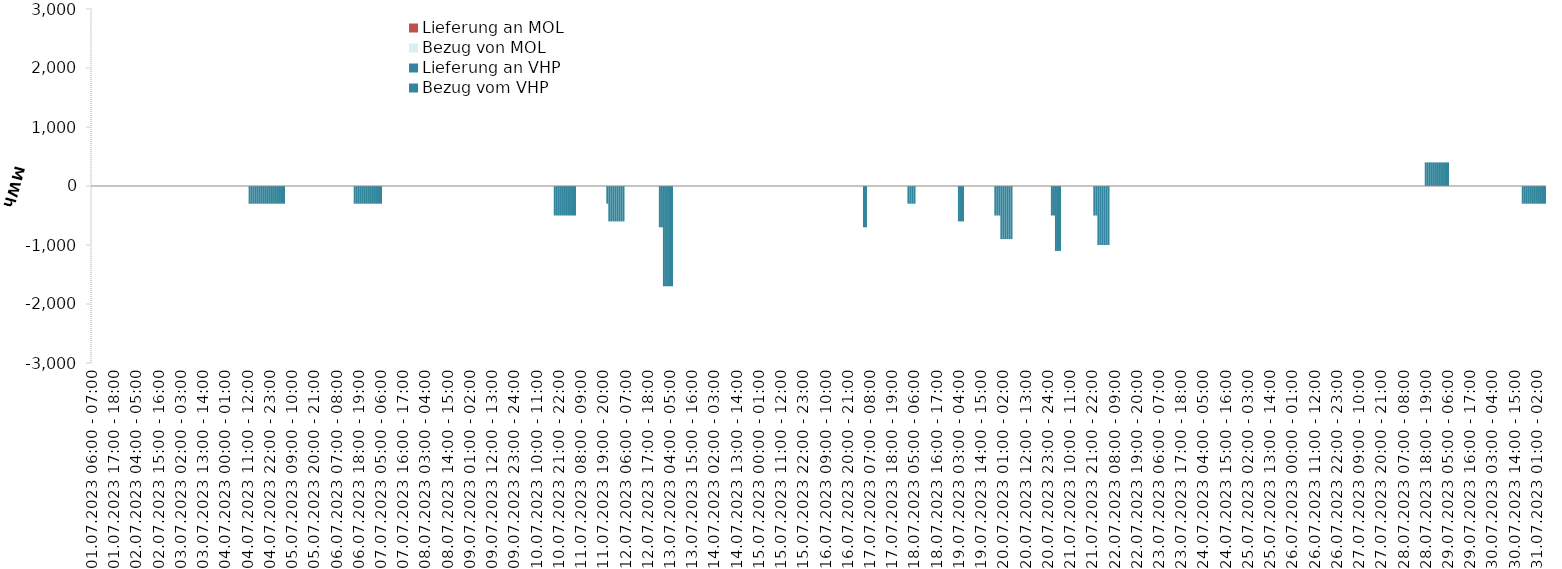
| Category | Bezug vom VHP | Lieferung an VHP | Bezug von MOL | Lieferung an MOL |
|---|---|---|---|---|
| 01.07.2023 06:00 - 07:00 | 0 | 0 | 0 | 0 |
| 01.07.2023 07:00 - 08:00 | 0 | 0 | 0 | 0 |
| 01.07.2023 08:00 - 09:00 | 0 | 0 | 0 | 0 |
| 01.07.2023 09:00 - 10:00 | 0 | 0 | 0 | 0 |
| 01.07.2023 10:00 - 11:00 | 0 | 0 | 0 | 0 |
| 01.07.2023 11:00 - 12:00 | 0 | 0 | 0 | 0 |
| 01.07.2023 12:00 - 13:00 | 0 | 0 | 0 | 0 |
| 01.07.2023 13:00 - 14:00 | 0 | 0 | 0 | 0 |
| 01.07.2023 14:00 - 15:00 | 0 | 0 | 0 | 0 |
| 01.07.2023 15:00 - 16:00 | 0 | 0 | 0 | 0 |
| 01.07.2023 16:00 - 17:00 | 0 | 0 | 0 | 0 |
| 01.07.2023 17:00 - 18:00 | 0 | 0 | 0 | 0 |
| 01.07.2023 18:00 - 19:00 | 0 | 0 | 0 | 0 |
| 01.07.2023 19:00 - 20:00 | 0 | 0 | 0 | 0 |
| 01.07.2023 20:00 - 21:00 | 0 | 0 | 0 | 0 |
| 01.07.2023 21:00 - 22:00 | 0 | 0 | 0 | 0 |
| 01.07.2023 22:00 - 23:00 | 0 | 0 | 0 | 0 |
| 01.07.2023 23:00 - 24:00 | 0 | 0 | 0 | 0 |
| 02.07.2023 00:00 - 01:00 | 0 | 0 | 0 | 0 |
| 02.07.2023 01:00 - 02:00 | 0 | 0 | 0 | 0 |
| 02.07.2023 02:00 - 03:00 | 0 | 0 | 0 | 0 |
| 02.07.2023 03:00 - 04:00 | 0 | 0 | 0 | 0 |
| 02.07.2023 04:00 - 05:00 | 0 | 0 | 0 | 0 |
| 02.07.2023 05:00 - 06:00 | 0 | 0 | 0 | 0 |
| 02.07.2023 06:00 - 07:00 | 0 | 0 | 0 | 0 |
| 02.07.2023 07:00 - 08:00 | 0 | 0 | 0 | 0 |
| 02.07.2023 08:00 - 09:00 | 0 | 0 | 0 | 0 |
| 02.07.2023 09:00 - 10:00 | 0 | 0 | 0 | 0 |
| 02.07.2023 10:00 - 11:00 | 0 | 0 | 0 | 0 |
| 02.07.2023 11:00 - 12:00 | 0 | 0 | 0 | 0 |
| 02.07.2023 12:00 - 13:00 | 0 | 0 | 0 | 0 |
| 02.07.2023 13:00 - 14:00 | 0 | 0 | 0 | 0 |
| 02.07.2023 14:00 - 15:00 | 0 | 0 | 0 | 0 |
| 02.07.2023 15:00 - 16:00 | 0 | 0 | 0 | 0 |
| 02.07.2023 16:00 - 17:00 | 0 | 0 | 0 | 0 |
| 02.07.2023 17:00 - 18:00 | 0 | 0 | 0 | 0 |
| 02.07.2023 18:00 - 19:00 | 0 | 0 | 0 | 0 |
| 02.07.2023 19:00 - 20:00 | 0 | 0 | 0 | 0 |
| 02.07.2023 20:00 - 21:00 | 0 | 0 | 0 | 0 |
| 02.07.2023 21:00 - 22:00 | 0 | 0 | 0 | 0 |
| 02.07.2023 22:00 - 23:00 | 0 | 0 | 0 | 0 |
| 02.07.2023 23:00 - 24:00 | 0 | 0 | 0 | 0 |
| 03.07.2023 00:00 - 01:00 | 0 | 0 | 0 | 0 |
| 03.07.2023 01:00 - 02:00 | 0 | 0 | 0 | 0 |
| 03.07.2023 02:00 - 03:00 | 0 | 0 | 0 | 0 |
| 03.07.2023 03:00 - 04:00 | 0 | 0 | 0 | 0 |
| 03.07.2023 04:00 - 05:00 | 0 | 0 | 0 | 0 |
| 03.07.2023 05:00 - 06:00 | 0 | 0 | 0 | 0 |
| 03.07.2023 06:00 - 07:00 | 0 | 0 | 0 | 0 |
| 03.07.2023 07:00 - 08:00 | 0 | 0 | 0 | 0 |
| 03.07.2023 08:00 - 09:00 | 0 | 0 | 0 | 0 |
| 03.07.2023 09:00 - 10:00 | 0 | 0 | 0 | 0 |
| 03.07.2023 10:00 - 11:00 | 0 | 0 | 0 | 0 |
| 03.07.2023 11:00 - 12:00 | 0 | 0 | 0 | 0 |
| 03.07.2023 12:00 - 13:00 | 0 | 0 | 0 | 0 |
| 03.07.2023 13:00 - 14:00 | 0 | 0 | 0 | 0 |
| 03.07.2023 14:00 - 15:00 | 0 | 0 | 0 | 0 |
| 03.07.2023 15:00 - 16:00 | 0 | 0 | 0 | 0 |
| 03.07.2023 16:00 - 17:00 | 0 | 0 | 0 | 0 |
| 03.07.2023 17:00 - 18:00 | 0 | 0 | 0 | 0 |
| 03.07.2023 18:00 - 19:00 | 0 | 0 | 0 | 0 |
| 03.07.2023 19:00 - 20:00 | 0 | 0 | 0 | 0 |
| 03.07.2023 20:00 - 21:00 | 0 | 0 | 0 | 0 |
| 03.07.2023 21:00 - 22:00 | 0 | 0 | 0 | 0 |
| 03.07.2023 22:00 - 23:00 | 0 | 0 | 0 | 0 |
| 03.07.2023 23:00 - 24:00 | 0 | 0 | 0 | 0 |
| 04.07.2023 00:00 - 01:00 | 0 | 0 | 0 | 0 |
| 04.07.2023 01:00 - 02:00 | 0 | 0 | 0 | 0 |
| 04.07.2023 02:00 - 03:00 | 0 | 0 | 0 | 0 |
| 04.07.2023 03:00 - 04:00 | 0 | 0 | 0 | 0 |
| 04.07.2023 04:00 - 05:00 | 0 | 0 | 0 | 0 |
| 04.07.2023 05:00 - 06:00 | 0 | 0 | 0 | 0 |
| 04.07.2023 06:00 - 07:00 | 0 | 0 | 0 | 0 |
| 04.07.2023 07:00 - 08:00 | 0 | 0 | 0 | 0 |
| 04.07.2023 08:00 - 09:00 | 0 | 0 | 0 | 0 |
| 04.07.2023 09:00 - 10:00 | 0 | 0 | 0 | 0 |
| 04.07.2023 10:00 - 11:00 | 0 | 0 | 0 | 0 |
| 04.07.2023 11:00 - 12:00 | 0 | 0 | 0 | 0 |
| 04.07.2023 12:00 - 13:00 | 0 | -300 | 0 | 0 |
| 04.07.2023 13:00 - 14:00 | 0 | -300 | 0 | 0 |
| 04.07.2023 14:00 - 15:00 | 0 | -300 | 0 | 0 |
| 04.07.2023 15:00 - 16:00 | 0 | -300 | 0 | 0 |
| 04.07.2023 16:00 - 17:00 | 0 | -300 | 0 | 0 |
| 04.07.2023 17:00 - 18:00 | 0 | -300 | 0 | 0 |
| 04.07.2023 18:00 - 19:00 | 0 | -300 | 0 | 0 |
| 04.07.2023 19:00 - 20:00 | 0 | -300 | 0 | 0 |
| 04.07.2023 20:00 - 21:00 | 0 | -300 | 0 | 0 |
| 04.07.2023 21:00 - 22:00 | 0 | -300 | 0 | 0 |
| 04.07.2023 22:00 - 23:00 | 0 | -300 | 0 | 0 |
| 04.07.2023 23:00 - 24:00 | 0 | -300 | 0 | 0 |
| 05.07.2023 00:00 - 01:00 | 0 | -300 | 0 | 0 |
| 05.07.2023 01:00 - 02:00 | 0 | -300 | 0 | 0 |
| 05.07.2023 02:00 - 03:00 | 0 | -300 | 0 | 0 |
| 05.07.2023 03:00 - 04:00 | 0 | -300 | 0 | 0 |
| 05.07.2023 04:00 - 05:00 | 0 | -300 | 0 | 0 |
| 05.07.2023 05:00 - 06:00 | 0 | -300 | 0 | 0 |
| 05.07.2023 06:00 - 07:00 | 0 | 0 | 0 | 0 |
| 05.07.2023 07:00 - 08:00 | 0 | 0 | 0 | 0 |
| 05.07.2023 08:00 - 09:00 | 0 | 0 | 0 | 0 |
| 05.07.2023 09:00 - 10:00 | 0 | 0 | 0 | 0 |
| 05.07.2023 10:00 - 11:00 | 0 | 0 | 0 | 0 |
| 05.07.2023 11:00 - 12:00 | 0 | 0 | 0 | 0 |
| 05.07.2023 12:00 - 13:00 | 0 | 0 | 0 | 0 |
| 05.07.2023 13:00 - 14:00 | 0 | 0 | 0 | 0 |
| 05.07.2023 14:00 - 15:00 | 0 | 0 | 0 | 0 |
| 05.07.2023 15:00 - 16:00 | 0 | 0 | 0 | 0 |
| 05.07.2023 16:00 - 17:00 | 0 | 0 | 0 | 0 |
| 05.07.2023 17:00 - 18:00 | 0 | 0 | 0 | 0 |
| 05.07.2023 18:00 - 19:00 | 0 | 0 | 0 | 0 |
| 05.07.2023 19:00 - 20:00 | 0 | 0 | 0 | 0 |
| 05.07.2023 20:00 - 21:00 | 0 | 0 | 0 | 0 |
| 05.07.2023 21:00 - 22:00 | 0 | 0 | 0 | 0 |
| 05.07.2023 22:00 - 23:00 | 0 | 0 | 0 | 0 |
| 05.07.2023 23:00 - 24:00 | 0 | 0 | 0 | 0 |
| 06.07.2023 00:00 - 01:00 | 0 | 0 | 0 | 0 |
| 06.07.2023 01:00 - 02:00 | 0 | 0 | 0 | 0 |
| 06.07.2023 02:00 - 03:00 | 0 | 0 | 0 | 0 |
| 06.07.2023 03:00 - 04:00 | 0 | 0 | 0 | 0 |
| 06.07.2023 04:00 - 05:00 | 0 | 0 | 0 | 0 |
| 06.07.2023 05:00 - 06:00 | 0 | 0 | 0 | 0 |
| 06.07.2023 06:00 - 07:00 | 0 | 0 | 0 | 0 |
| 06.07.2023 07:00 - 08:00 | 0 | 0 | 0 | 0 |
| 06.07.2023 08:00 - 09:00 | 0 | 0 | 0 | 0 |
| 06.07.2023 09:00 - 10:00 | 0 | 0 | 0 | 0 |
| 06.07.2023 10:00 - 11:00 | 0 | 0 | 0 | 0 |
| 06.07.2023 11:00 - 12:00 | 0 | 0 | 0 | 0 |
| 06.07.2023 12:00 - 13:00 | 0 | 0 | 0 | 0 |
| 06.07.2023 13:00 - 14:00 | 0 | 0 | 0 | 0 |
| 06.07.2023 14:00 - 15:00 | 0 | 0 | 0 | 0 |
| 06.07.2023 15:00 - 16:00 | 0 | 0 | 0 | 0 |
| 06.07.2023 16:00 - 17:00 | 0 | -300 | 0 | 0 |
| 06.07.2023 17:00 - 18:00 | 0 | -300 | 0 | 0 |
| 06.07.2023 18:00 - 19:00 | 0 | -300 | 0 | 0 |
| 06.07.2023 19:00 - 20:00 | 0 | -300 | 0 | 0 |
| 06.07.2023 20:00 - 21:00 | 0 | -300 | 0 | 0 |
| 06.07.2023 21:00 - 22:00 | 0 | -300 | 0 | 0 |
| 06.07.2023 22:00 - 23:00 | 0 | -300 | 0 | 0 |
| 06.07.2023 23:00 - 24:00 | 0 | -300 | 0 | 0 |
| 07.07.2023 00:00 - 01:00 | 0 | -300 | 0 | 0 |
| 07.07.2023 01:00 - 02:00 | 0 | -300 | 0 | 0 |
| 07.07.2023 02:00 - 03:00 | 0 | -300 | 0 | 0 |
| 07.07.2023 03:00 - 04:00 | 0 | -300 | 0 | 0 |
| 07.07.2023 04:00 - 05:00 | 0 | -300 | 0 | 0 |
| 07.07.2023 05:00 - 06:00 | 0 | -300 | 0 | 0 |
| 07.07.2023 06:00 - 07:00 | 0 | 0 | 0 | 0 |
| 07.07.2023 07:00 - 08:00 | 0 | 0 | 0 | 0 |
| 07.07.2023 08:00 - 09:00 | 0 | 0 | 0 | 0 |
| 07.07.2023 09:00 - 10:00 | 0 | 0 | 0 | 0 |
| 07.07.2023 10:00 - 11:00 | 0 | 0 | 0 | 0 |
| 07.07.2023 11:00 - 12:00 | 0 | 0 | 0 | 0 |
| 07.07.2023 12:00 - 13:00 | 0 | 0 | 0 | 0 |
| 07.07.2023 13:00 - 14:00 | 0 | 0 | 0 | 0 |
| 07.07.2023 14:00 - 15:00 | 0 | 0 | 0 | 0 |
| 07.07.2023 15:00 - 16:00 | 0 | 0 | 0 | 0 |
| 07.07.2023 16:00 - 17:00 | 0 | 0 | 0 | 0 |
| 07.07.2023 17:00 - 18:00 | 0 | 0 | 0 | 0 |
| 07.07.2023 18:00 - 19:00 | 0 | 0 | 0 | 0 |
| 07.07.2023 19:00 - 20:00 | 0 | 0 | 0 | 0 |
| 07.07.2023 20:00 - 21:00 | 0 | 0 | 0 | 0 |
| 07.07.2023 21:00 - 22:00 | 0 | 0 | 0 | 0 |
| 07.07.2023 22:00 - 23:00 | 0 | 0 | 0 | 0 |
| 07.07.2023 23:00 - 24:00 | 0 | 0 | 0 | 0 |
| 08.07.2023 00:00 - 01:00 | 0 | 0 | 0 | 0 |
| 08.07.2023 01:00 - 02:00 | 0 | 0 | 0 | 0 |
| 08.07.2023 02:00 - 03:00 | 0 | 0 | 0 | 0 |
| 08.07.2023 03:00 - 04:00 | 0 | 0 | 0 | 0 |
| 08.07.2023 04:00 - 05:00 | 0 | 0 | 0 | 0 |
| 08.07.2023 05:00 - 06:00 | 0 | 0 | 0 | 0 |
| 08.07.2023 06:00 - 07:00 | 0 | 0 | 0 | 0 |
| 08.07.2023 07:00 - 08:00 | 0 | 0 | 0 | 0 |
| 08.07.2023 08:00 - 09:00 | 0 | 0 | 0 | 0 |
| 08.07.2023 09:00 - 10:00 | 0 | 0 | 0 | 0 |
| 08.07.2023 10:00 - 11:00 | 0 | 0 | 0 | 0 |
| 08.07.2023 11:00 - 12:00 | 0 | 0 | 0 | 0 |
| 08.07.2023 12:00 - 13:00 | 0 | 0 | 0 | 0 |
| 08.07.2023 13:00 - 14:00 | 0 | 0 | 0 | 0 |
| 08.07.2023 14:00 - 15:00 | 0 | 0 | 0 | 0 |
| 08.07.2023 15:00 - 16:00 | 0 | 0 | 0 | 0 |
| 08.07.2023 16:00 - 17:00 | 0 | 0 | 0 | 0 |
| 08.07.2023 17:00 - 18:00 | 0 | 0 | 0 | 0 |
| 08.07.2023 18:00 - 19:00 | 0 | 0 | 0 | 0 |
| 08.07.2023 19:00 - 20:00 | 0 | 0 | 0 | 0 |
| 08.07.2023 20:00 - 21:00 | 0 | 0 | 0 | 0 |
| 08.07.2023 21:00 - 22:00 | 0 | 0 | 0 | 0 |
| 08.07.2023 22:00 - 23:00 | 0 | 0 | 0 | 0 |
| 08.07.2023 23:00 - 24:00 | 0 | 0 | 0 | 0 |
| 09.07.2023 00:00 - 01:00 | 0 | 0 | 0 | 0 |
| 09.07.2023 01:00 - 02:00 | 0 | 0 | 0 | 0 |
| 09.07.2023 02:00 - 03:00 | 0 | 0 | 0 | 0 |
| 09.07.2023 03:00 - 04:00 | 0 | 0 | 0 | 0 |
| 09.07.2023 04:00 - 05:00 | 0 | 0 | 0 | 0 |
| 09.07.2023 05:00 - 06:00 | 0 | 0 | 0 | 0 |
| 09.07.2023 06:00 - 07:00 | 0 | 0 | 0 | 0 |
| 09.07.2023 07:00 - 08:00 | 0 | 0 | 0 | 0 |
| 09.07.2023 08:00 - 09:00 | 0 | 0 | 0 | 0 |
| 09.07.2023 09:00 - 10:00 | 0 | 0 | 0 | 0 |
| 09.07.2023 10:00 - 11:00 | 0 | 0 | 0 | 0 |
| 09.07.2023 11:00 - 12:00 | 0 | 0 | 0 | 0 |
| 09.07.2023 12:00 - 13:00 | 0 | 0 | 0 | 0 |
| 09.07.2023 13:00 - 14:00 | 0 | 0 | 0 | 0 |
| 09.07.2023 14:00 - 15:00 | 0 | 0 | 0 | 0 |
| 09.07.2023 15:00 - 16:00 | 0 | 0 | 0 | 0 |
| 09.07.2023 16:00 - 17:00 | 0 | 0 | 0 | 0 |
| 09.07.2023 17:00 - 18:00 | 0 | 0 | 0 | 0 |
| 09.07.2023 18:00 - 19:00 | 0 | 0 | 0 | 0 |
| 09.07.2023 19:00 - 20:00 | 0 | 0 | 0 | 0 |
| 09.07.2023 20:00 - 21:00 | 0 | 0 | 0 | 0 |
| 09.07.2023 21:00 - 22:00 | 0 | 0 | 0 | 0 |
| 09.07.2023 22:00 - 23:00 | 0 | 0 | 0 | 0 |
| 09.07.2023 23:00 - 24:00 | 0 | 0 | 0 | 0 |
| 10.07.2023 00:00 - 01:00 | 0 | 0 | 0 | 0 |
| 10.07.2023 01:00 - 02:00 | 0 | 0 | 0 | 0 |
| 10.07.2023 02:00 - 03:00 | 0 | 0 | 0 | 0 |
| 10.07.2023 03:00 - 04:00 | 0 | 0 | 0 | 0 |
| 10.07.2023 04:00 - 05:00 | 0 | 0 | 0 | 0 |
| 10.07.2023 05:00 - 06:00 | 0 | 0 | 0 | 0 |
| 10.07.2023 06:00 - 07:00 | 0 | 0 | 0 | 0 |
| 10.07.2023 07:00 - 08:00 | 0 | 0 | 0 | 0 |
| 10.07.2023 08:00 - 09:00 | 0 | 0 | 0 | 0 |
| 10.07.2023 09:00 - 10:00 | 0 | 0 | 0 | 0 |
| 10.07.2023 10:00 - 11:00 | 0 | 0 | 0 | 0 |
| 10.07.2023 11:00 - 12:00 | 0 | 0 | 0 | 0 |
| 10.07.2023 12:00 - 13:00 | 0 | 0 | 0 | 0 |
| 10.07.2023 13:00 - 14:00 | 0 | 0 | 0 | 0 |
| 10.07.2023 14:00 - 15:00 | 0 | 0 | 0 | 0 |
| 10.07.2023 15:00 - 16:00 | 0 | 0 | 0 | 0 |
| 10.07.2023 16:00 - 17:00 | 0 | 0 | 0 | 0 |
| 10.07.2023 17:00 - 18:00 | 0 | 0 | 0 | 0 |
| 10.07.2023 18:00 - 19:00 | 0 | 0 | 0 | 0 |
| 10.07.2023 19:00 - 20:00 | 0 | -500 | 0 | 0 |
| 10.07.2023 20:00 - 21:00 | 0 | -500 | 0 | 0 |
| 10.07.2023 21:00 - 22:00 | 0 | -500 | 0 | 0 |
| 10.07.2023 22:00 - 23:00 | 0 | -500 | 0 | 0 |
| 10.07.2023 23:00 - 24:00 | 0 | -500 | 0 | 0 |
| 11.07.2023 00:00 - 01:00 | 0 | -500 | 0 | 0 |
| 11.07.2023 01:00 - 02:00 | 0 | -500 | 0 | 0 |
| 11.07.2023 02:00 - 03:00 | 0 | -500 | 0 | 0 |
| 11.07.2023 03:00 - 04:00 | 0 | -500 | 0 | 0 |
| 11.07.2023 04:00 - 05:00 | 0 | -500 | 0 | 0 |
| 11.07.2023 05:00 - 06:00 | 0 | -500 | 0 | 0 |
| 11.07.2023 06:00 - 07:00 | 0 | 0 | 0 | 0 |
| 11.07.2023 07:00 - 08:00 | 0 | 0 | 0 | 0 |
| 11.07.2023 08:00 - 09:00 | 0 | 0 | 0 | 0 |
| 11.07.2023 09:00 - 10:00 | 0 | 0 | 0 | 0 |
| 11.07.2023 10:00 - 11:00 | 0 | 0 | 0 | 0 |
| 11.07.2023 11:00 - 12:00 | 0 | 0 | 0 | 0 |
| 11.07.2023 12:00 - 13:00 | 0 | 0 | 0 | 0 |
| 11.07.2023 13:00 - 14:00 | 0 | 0 | 0 | 0 |
| 11.07.2023 14:00 - 15:00 | 0 | 0 | 0 | 0 |
| 11.07.2023 15:00 - 16:00 | 0 | 0 | 0 | 0 |
| 11.07.2023 16:00 - 17:00 | 0 | 0 | 0 | 0 |
| 11.07.2023 17:00 - 18:00 | 0 | 0 | 0 | 0 |
| 11.07.2023 18:00 - 19:00 | 0 | 0 | 0 | 0 |
| 11.07.2023 19:00 - 20:00 | 0 | 0 | 0 | 0 |
| 11.07.2023 20:00 - 21:00 | 0 | 0 | 0 | 0 |
| 11.07.2023 21:00 - 22:00 | 0 | -300 | 0 | 0 |
| 11.07.2023 22:00 - 23:00 | 0 | -600 | 0 | 0 |
| 11.07.2023 23:00 - 24:00 | 0 | -600 | 0 | 0 |
| 12.07.2023 00:00 - 01:00 | 0 | -600 | 0 | 0 |
| 12.07.2023 01:00 - 02:00 | 0 | -600 | 0 | 0 |
| 12.07.2023 02:00 - 03:00 | 0 | -600 | 0 | 0 |
| 12.07.2023 03:00 - 04:00 | 0 | -600 | 0 | 0 |
| 12.07.2023 04:00 - 05:00 | 0 | -600 | 0 | 0 |
| 12.07.2023 05:00 - 06:00 | 0 | -600 | 0 | 0 |
| 12.07.2023 06:00 - 07:00 | 0 | 0 | 0 | 0 |
| 12.07.2023 07:00 - 08:00 | 0 | 0 | 0 | 0 |
| 12.07.2023 08:00 - 09:00 | 0 | 0 | 0 | 0 |
| 12.07.2023 09:00 - 10:00 | 0 | 0 | 0 | 0 |
| 12.07.2023 10:00 - 11:00 | 0 | 0 | 0 | 0 |
| 12.07.2023 11:00 - 12:00 | 0 | 0 | 0 | 0 |
| 12.07.2023 12:00 - 13:00 | 0 | 0 | 0 | 0 |
| 12.07.2023 13:00 - 14:00 | 0 | 0 | 0 | 0 |
| 12.07.2023 14:00 - 15:00 | 0 | 0 | 0 | 0 |
| 12.07.2023 15:00 - 16:00 | 0 | 0 | 0 | 0 |
| 12.07.2023 16:00 - 17:00 | 0 | 0 | 0 | 0 |
| 12.07.2023 17:00 - 18:00 | 0 | 0 | 0 | 0 |
| 12.07.2023 18:00 - 19:00 | 0 | 0 | 0 | 0 |
| 12.07.2023 19:00 - 20:00 | 0 | 0 | 0 | 0 |
| 12.07.2023 20:00 - 21:00 | 0 | 0 | 0 | 0 |
| 12.07.2023 21:00 - 22:00 | 0 | 0 | 0 | 0 |
| 12.07.2023 22:00 - 23:00 | 0 | 0 | 0 | 0 |
| 12.07.2023 23:00 - 24:00 | 0 | -700 | 0 | 0 |
| 13.07.2023 00:00 - 01:00 | 0 | -700 | 0 | 0 |
| 13.07.2023 01:00 - 02:00 | 0 | -1700 | 0 | 0 |
| 13.07.2023 02:00 - 03:00 | 0 | -1700 | 0 | 0 |
| 13.07.2023 03:00 - 04:00 | 0 | -1700 | 0 | 0 |
| 13.07.2023 04:00 - 05:00 | 0 | -1700 | 0 | 0 |
| 13.07.2023 05:00 - 06:00 | 0 | -1700 | 0 | 0 |
| 13.07.2023 06:00 - 07:00 | 0 | 0 | 0 | 0 |
| 13.07.2023 07:00 - 08:00 | 0 | 0 | 0 | 0 |
| 13.07.2023 08:00 - 09:00 | 0 | 0 | 0 | 0 |
| 13.07.2023 09:00 - 10:00 | 0 | 0 | 0 | 0 |
| 13.07.2023 10:00 - 11:00 | 0 | 0 | 0 | 0 |
| 13.07.2023 11:00 - 12:00 | 0 | 0 | 0 | 0 |
| 13.07.2023 12:00 - 13:00 | 0 | 0 | 0 | 0 |
| 13.07.2023 13:00 - 14:00 | 0 | 0 | 0 | 0 |
| 13.07.2023 14:00 - 15:00 | 0 | 0 | 0 | 0 |
| 13.07.2023 15:00 - 16:00 | 0 | 0 | 0 | 0 |
| 13.07.2023 16:00 - 17:00 | 0 | 0 | 0 | 0 |
| 13.07.2023 17:00 - 18:00 | 0 | 0 | 0 | 0 |
| 13.07.2023 18:00 - 19:00 | 0 | 0 | 0 | 0 |
| 13.07.2023 19:00 - 20:00 | 0 | 0 | 0 | 0 |
| 13.07.2023 20:00 - 21:00 | 0 | 0 | 0 | 0 |
| 13.07.2023 21:00 - 22:00 | 0 | 0 | 0 | 0 |
| 13.07.2023 22:00 - 23:00 | 0 | 0 | 0 | 0 |
| 13.07.2023 23:00 - 24:00 | 0 | 0 | 0 | 0 |
| 14.07.2023 00:00 - 01:00 | 0 | 0 | 0 | 0 |
| 14.07.2023 01:00 - 02:00 | 0 | 0 | 0 | 0 |
| 14.07.2023 02:00 - 03:00 | 0 | 0 | 0 | 0 |
| 14.07.2023 03:00 - 04:00 | 0 | 0 | 0 | 0 |
| 14.07.2023 04:00 - 05:00 | 0 | 0 | 0 | 0 |
| 14.07.2023 05:00 - 06:00 | 0 | 0 | 0 | 0 |
| 14.07.2023 06:00 - 07:00 | 0 | 0 | 0 | 0 |
| 14.07.2023 07:00 - 08:00 | 0 | 0 | 0 | 0 |
| 14.07.2023 08:00 - 09:00 | 0 | 0 | 0 | 0 |
| 14.07.2023 09:00 - 10:00 | 0 | 0 | 0 | 0 |
| 14.07.2023 10:00 - 11:00 | 0 | 0 | 0 | 0 |
| 14.07.2023 11:00 - 12:00 | 0 | 0 | 0 | 0 |
| 14.07.2023 12:00 - 13:00 | 0 | 0 | 0 | 0 |
| 14.07.2023 13:00 - 14:00 | 0 | 0 | 0 | 0 |
| 14.07.2023 14:00 - 15:00 | 0 | 0 | 0 | 0 |
| 14.07.2023 15:00 - 16:00 | 0 | 0 | 0 | 0 |
| 14.07.2023 16:00 - 17:00 | 0 | 0 | 0 | 0 |
| 14.07.2023 17:00 - 18:00 | 0 | 0 | 0 | 0 |
| 14.07.2023 18:00 - 19:00 | 0 | 0 | 0 | 0 |
| 14.07.2023 19:00 - 20:00 | 0 | 0 | 0 | 0 |
| 14.07.2023 20:00 - 21:00 | 0 | 0 | 0 | 0 |
| 14.07.2023 21:00 - 22:00 | 0 | 0 | 0 | 0 |
| 14.07.2023 22:00 - 23:00 | 0 | 0 | 0 | 0 |
| 14.07.2023 23:00 - 24:00 | 0 | 0 | 0 | 0 |
| 15.07.2023 00:00 - 01:00 | 0 | 0 | 0 | 0 |
| 15.07.2023 01:00 - 02:00 | 0 | 0 | 0 | 0 |
| 15.07.2023 02:00 - 03:00 | 0 | 0 | 0 | 0 |
| 15.07.2023 03:00 - 04:00 | 0 | 0 | 0 | 0 |
| 15.07.2023 04:00 - 05:00 | 0 | 0 | 0 | 0 |
| 15.07.2023 05:00 - 06:00 | 0 | 0 | 0 | 0 |
| 15.07.2023 06:00 - 07:00 | 0 | 0 | 0 | 0 |
| 15.07.2023 07:00 - 08:00 | 0 | 0 | 0 | 0 |
| 15.07.2023 08:00 - 09:00 | 0 | 0 | 0 | 0 |
| 15.07.2023 09:00 - 10:00 | 0 | 0 | 0 | 0 |
| 15.07.2023 10:00 - 11:00 | 0 | 0 | 0 | 0 |
| 15.07.2023 11:00 - 12:00 | 0 | 0 | 0 | 0 |
| 15.07.2023 12:00 - 13:00 | 0 | 0 | 0 | 0 |
| 15.07.2023 13:00 - 14:00 | 0 | 0 | 0 | 0 |
| 15.07.2023 14:00 - 15:00 | 0 | 0 | 0 | 0 |
| 15.07.2023 15:00 - 16:00 | 0 | 0 | 0 | 0 |
| 15.07.2023 16:00 - 17:00 | 0 | 0 | 0 | 0 |
| 15.07.2023 17:00 - 18:00 | 0 | 0 | 0 | 0 |
| 15.07.2023 18:00 - 19:00 | 0 | 0 | 0 | 0 |
| 15.07.2023 19:00 - 20:00 | 0 | 0 | 0 | 0 |
| 15.07.2023 20:00 - 21:00 | 0 | 0 | 0 | 0 |
| 15.07.2023 21:00 - 22:00 | 0 | 0 | 0 | 0 |
| 15.07.2023 22:00 - 23:00 | 0 | 0 | 0 | 0 |
| 15.07.2023 23:00 - 24:00 | 0 | 0 | 0 | 0 |
| 16.07.2023 00:00 - 01:00 | 0 | 0 | 0 | 0 |
| 16.07.2023 01:00 - 02:00 | 0 | 0 | 0 | 0 |
| 16.07.2023 02:00 - 03:00 | 0 | 0 | 0 | 0 |
| 16.07.2023 03:00 - 04:00 | 0 | 0 | 0 | 0 |
| 16.07.2023 04:00 - 05:00 | 0 | 0 | 0 | 0 |
| 16.07.2023 05:00 - 06:00 | 0 | 0 | 0 | 0 |
| 16.07.2023 06:00 - 07:00 | 0 | 0 | 0 | 0 |
| 16.07.2023 07:00 - 08:00 | 0 | 0 | 0 | 0 |
| 16.07.2023 08:00 - 09:00 | 0 | 0 | 0 | 0 |
| 16.07.2023 09:00 - 10:00 | 0 | 0 | 0 | 0 |
| 16.07.2023 10:00 - 11:00 | 0 | 0 | 0 | 0 |
| 16.07.2023 11:00 - 12:00 | 0 | 0 | 0 | 0 |
| 16.07.2023 12:00 - 13:00 | 0 | 0 | 0 | 0 |
| 16.07.2023 13:00 - 14:00 | 0 | 0 | 0 | 0 |
| 16.07.2023 14:00 - 15:00 | 0 | 0 | 0 | 0 |
| 16.07.2023 15:00 - 16:00 | 0 | 0 | 0 | 0 |
| 16.07.2023 16:00 - 17:00 | 0 | 0 | 0 | 0 |
| 16.07.2023 17:00 - 18:00 | 0 | 0 | 0 | 0 |
| 16.07.2023 18:00 - 19:00 | 0 | 0 | 0 | 0 |
| 16.07.2023 19:00 - 20:00 | 0 | 0 | 0 | 0 |
| 16.07.2023 20:00 - 21:00 | 0 | 0 | 0 | 0 |
| 16.07.2023 21:00 - 22:00 | 0 | 0 | 0 | 0 |
| 16.07.2023 22:00 - 23:00 | 0 | 0 | 0 | 0 |
| 16.07.2023 23:00 - 24:00 | 0 | 0 | 0 | 0 |
| 17.07.2023 00:00 - 01:00 | 0 | 0 | 0 | 0 |
| 17.07.2023 01:00 - 02:00 | 0 | 0 | 0 | 0 |
| 17.07.2023 02:00 - 03:00 | 0 | 0 | 0 | 0 |
| 17.07.2023 03:00 - 04:00 | 0 | 0 | 0 | 0 |
| 17.07.2023 04:00 - 05:00 | 0 | -700 | 0 | 0 |
| 17.07.2023 05:00 - 06:00 | 0 | -700 | 0 | 0 |
| 17.07.2023 06:00 - 07:00 | 0 | 0 | 0 | 0 |
| 17.07.2023 07:00 - 08:00 | 0 | 0 | 0 | 0 |
| 17.07.2023 08:00 - 09:00 | 0 | 0 | 0 | 0 |
| 17.07.2023 09:00 - 10:00 | 0 | 0 | 0 | 0 |
| 17.07.2023 10:00 - 11:00 | 0 | 0 | 0 | 0 |
| 17.07.2023 11:00 - 12:00 | 0 | 0 | 0 | 0 |
| 17.07.2023 12:00 - 13:00 | 0 | 0 | 0 | 0 |
| 17.07.2023 13:00 - 14:00 | 0 | 0 | 0 | 0 |
| 17.07.2023 14:00 - 15:00 | 0 | 0 | 0 | 0 |
| 17.07.2023 15:00 - 16:00 | 0 | 0 | 0 | 0 |
| 17.07.2023 16:00 - 17:00 | 0 | 0 | 0 | 0 |
| 17.07.2023 17:00 - 18:00 | 0 | 0 | 0 | 0 |
| 17.07.2023 18:00 - 19:00 | 0 | 0 | 0 | 0 |
| 17.07.2023 19:00 - 20:00 | 0 | 0 | 0 | 0 |
| 17.07.2023 20:00 - 21:00 | 0 | 0 | 0 | 0 |
| 17.07.2023 21:00 - 22:00 | 0 | 0 | 0 | 0 |
| 17.07.2023 22:00 - 23:00 | 0 | 0 | 0 | 0 |
| 17.07.2023 23:00 - 24:00 | 0 | 0 | 0 | 0 |
| 18.07.2023 00:00 - 01:00 | 0 | 0 | 0 | 0 |
| 18.07.2023 01:00 - 02:00 | 0 | 0 | 0 | 0 |
| 18.07.2023 02:00 - 03:00 | 0 | -300 | 0 | 0 |
| 18.07.2023 03:00 - 04:00 | 0 | -300 | 0 | 0 |
| 18.07.2023 04:00 - 05:00 | 0 | -300 | 0 | 0 |
| 18.07.2023 05:00 - 06:00 | 0 | -300 | 0 | 0 |
| 18.07.2023 06:00 - 07:00 | 0 | 0 | 0 | 0 |
| 18.07.2023 07:00 - 08:00 | 0 | 0 | 0 | 0 |
| 18.07.2023 08:00 - 09:00 | 0 | 0 | 0 | 0 |
| 18.07.2023 09:00 - 10:00 | 0 | 0 | 0 | 0 |
| 18.07.2023 10:00 - 11:00 | 0 | 0 | 0 | 0 |
| 18.07.2023 11:00 - 12:00 | 0 | 0 | 0 | 0 |
| 18.07.2023 12:00 - 13:00 | 0 | 0 | 0 | 0 |
| 18.07.2023 13:00 - 14:00 | 0 | 0 | 0 | 0 |
| 18.07.2023 14:00 - 15:00 | 0 | 0 | 0 | 0 |
| 18.07.2023 15:00 - 16:00 | 0 | 0 | 0 | 0 |
| 18.07.2023 16:00 - 17:00 | 0 | 0 | 0 | 0 |
| 18.07.2023 17:00 - 18:00 | 0 | 0 | 0 | 0 |
| 18.07.2023 18:00 - 19:00 | 0 | 0 | 0 | 0 |
| 18.07.2023 19:00 - 20:00 | 0 | 0 | 0 | 0 |
| 18.07.2023 20:00 - 21:00 | 0 | 0 | 0 | 0 |
| 18.07.2023 21:00 - 22:00 | 0 | 0 | 0 | 0 |
| 18.07.2023 22:00 - 23:00 | 0 | 0 | 0 | 0 |
| 18.07.2023 23:00 - 24:00 | 0 | 0 | 0 | 0 |
| 19.07.2023 00:00 - 01:00 | 0 | 0 | 0 | 0 |
| 19.07.2023 01:00 - 02:00 | 0 | 0 | 0 | 0 |
| 19.07.2023 02:00 - 03:00 | 0 | 0 | 0 | 0 |
| 19.07.2023 03:00 - 04:00 | 0 | -600 | 0 | 0 |
| 19.07.2023 04:00 - 05:00 | 0 | -600 | 0 | 0 |
| 19.07.2023 05:00 - 06:00 | 0 | -600 | 0 | 0 |
| 19.07.2023 06:00 - 07:00 | 0 | 0 | 0 | 0 |
| 19.07.2023 07:00 - 08:00 | 0 | 0 | 0 | 0 |
| 19.07.2023 08:00 - 09:00 | 0 | 0 | 0 | 0 |
| 19.07.2023 09:00 - 10:00 | 0 | 0 | 0 | 0 |
| 19.07.2023 10:00 - 11:00 | 0 | 0 | 0 | 0 |
| 19.07.2023 11:00 - 12:00 | 0 | 0 | 0 | 0 |
| 19.07.2023 12:00 - 13:00 | 0 | 0 | 0 | 0 |
| 19.07.2023 13:00 - 14:00 | 0 | 0 | 0 | 0 |
| 19.07.2023 14:00 - 15:00 | 0 | 0 | 0 | 0 |
| 19.07.2023 15:00 - 16:00 | 0 | 0 | 0 | 0 |
| 19.07.2023 16:00 - 17:00 | 0 | 0 | 0 | 0 |
| 19.07.2023 17:00 - 18:00 | 0 | 0 | 0 | 0 |
| 19.07.2023 18:00 - 19:00 | 0 | 0 | 0 | 0 |
| 19.07.2023 19:00 - 20:00 | 0 | 0 | 0 | 0 |
| 19.07.2023 20:00 - 21:00 | 0 | 0 | 0 | 0 |
| 19.07.2023 21:00 - 22:00 | 0 | -500 | 0 | 0 |
| 19.07.2023 22:00 - 23:00 | 0 | -500 | 0 | 0 |
| 19.07.2023 23:00 - 24:00 | 0 | -500 | 0 | 0 |
| 20.07.2023 00:00 - 01:00 | 0 | -900 | 0 | 0 |
| 20.07.2023 01:00 - 02:00 | 0 | -900 | 0 | 0 |
| 20.07.2023 02:00 - 03:00 | 0 | -900 | 0 | 0 |
| 20.07.2023 03:00 - 04:00 | 0 | -900 | 0 | 0 |
| 20.07.2023 04:00 - 05:00 | 0 | -900 | 0 | 0 |
| 20.07.2023 05:00 - 06:00 | 0 | -900 | 0 | 0 |
| 20.07.2023 06:00 - 07:00 | 0 | 0 | 0 | 0 |
| 20.07.2023 07:00 - 08:00 | 0 | 0 | 0 | 0 |
| 20.07.2023 08:00 - 09:00 | 0 | 0 | 0 | 0 |
| 20.07.2023 09:00 - 10:00 | 0 | 0 | 0 | 0 |
| 20.07.2023 10:00 - 11:00 | 0 | 0 | 0 | 0 |
| 20.07.2023 11:00 - 12:00 | 0 | 0 | 0 | 0 |
| 20.07.2023 12:00 - 13:00 | 0 | 0 | 0 | 0 |
| 20.07.2023 13:00 - 14:00 | 0 | 0 | 0 | 0 |
| 20.07.2023 14:00 - 15:00 | 0 | 0 | 0 | 0 |
| 20.07.2023 15:00 - 16:00 | 0 | 0 | 0 | 0 |
| 20.07.2023 16:00 - 17:00 | 0 | 0 | 0 | 0 |
| 20.07.2023 17:00 - 18:00 | 0 | 0 | 0 | 0 |
| 20.07.2023 18:00 - 19:00 | 0 | 0 | 0 | 0 |
| 20.07.2023 19:00 - 20:00 | 0 | 0 | 0 | 0 |
| 20.07.2023 20:00 - 21:00 | 0 | 0 | 0 | 0 |
| 20.07.2023 21:00 - 22:00 | 0 | 0 | 0 | 0 |
| 20.07.2023 22:00 - 23:00 | 0 | 0 | 0 | 0 |
| 20.07.2023 23:00 - 24:00 | 0 | 0 | 0 | 0 |
| 21.07.2023 00:00 - 01:00 | 0 | 0 | 0 | 0 |
| 21.07.2023 01:00 - 02:00 | 0 | -500 | 0 | 0 |
| 21.07.2023 02:00 - 03:00 | 0 | -500 | 0 | 0 |
| 21.07.2023 03:00 - 04:00 | 0 | -1100 | 0 | 0 |
| 21.07.2023 04:00 - 05:00 | 0 | -1100 | 0 | 0 |
| 21.07.2023 05:00 - 06:00 | 0 | -1100 | 0 | 0 |
| 21.07.2023 06:00 - 07:00 | 0 | 0 | 0 | 0 |
| 21.07.2023 07:00 - 08:00 | 0 | 0 | 0 | 0 |
| 21.07.2023 08:00 - 09:00 | 0 | 0 | 0 | 0 |
| 21.07.2023 09:00 - 10:00 | 0 | 0 | 0 | 0 |
| 21.07.2023 10:00 - 11:00 | 0 | 0 | 0 | 0 |
| 21.07.2023 11:00 - 12:00 | 0 | 0 | 0 | 0 |
| 21.07.2023 12:00 - 13:00 | 0 | 0 | 0 | 0 |
| 21.07.2023 13:00 - 14:00 | 0 | 0 | 0 | 0 |
| 21.07.2023 14:00 - 15:00 | 0 | 0 | 0 | 0 |
| 21.07.2023 15:00 - 16:00 | 0 | 0 | 0 | 0 |
| 21.07.2023 16:00 - 17:00 | 0 | 0 | 0 | 0 |
| 21.07.2023 17:00 - 18:00 | 0 | 0 | 0 | 0 |
| 21.07.2023 18:00 - 19:00 | 0 | 0 | 0 | 0 |
| 21.07.2023 19:00 - 20:00 | 0 | 0 | 0 | 0 |
| 21.07.2023 20:00 - 21:00 | 0 | 0 | 0 | 0 |
| 21.07.2023 21:00 - 22:00 | 0 | 0 | 0 | 0 |
| 21.07.2023 22:00 - 23:00 | 0 | -500 | 0 | 0 |
| 21.07.2023 23:00 - 24:00 | 0 | -500 | 0 | 0 |
| 22.07.2023 00:00 - 01:00 | 0 | -1000 | 0 | 0 |
| 22.07.2023 01:00 - 02:00 | 0 | -1000 | 0 | 0 |
| 22.07.2023 02:00 - 03:00 | 0 | -1000 | 0 | 0 |
| 22.07.2023 03:00 - 04:00 | 0 | -1000 | 0 | 0 |
| 22.07.2023 04:00 - 05:00 | 0 | -1000 | 0 | 0 |
| 22.07.2023 05:00 - 06:00 | 0 | -1000 | 0 | 0 |
| 22.07.2023 06:00 - 07:00 | 0 | 0 | 0 | 0 |
| 22.07.2023 07:00 - 08:00 | 0 | 0 | 0 | 0 |
| 22.07.2023 08:00 - 09:00 | 0 | 0 | 0 | 0 |
| 22.07.2023 09:00 - 10:00 | 0 | 0 | 0 | 0 |
| 22.07.2023 10:00 - 11:00 | 0 | 0 | 0 | 0 |
| 22.07.2023 11:00 - 12:00 | 0 | 0 | 0 | 0 |
| 22.07.2023 12:00 - 13:00 | 0 | 0 | 0 | 0 |
| 22.07.2023 13:00 - 14:00 | 0 | 0 | 0 | 0 |
| 22.07.2023 14:00 - 15:00 | 0 | 0 | 0 | 0 |
| 22.07.2023 15:00 - 16:00 | 0 | 0 | 0 | 0 |
| 22.07.2023 16:00 - 17:00 | 0 | 0 | 0 | 0 |
| 22.07.2023 17:00 - 18:00 | 0 | 0 | 0 | 0 |
| 22.07.2023 18:00 - 19:00 | 0 | 0 | 0 | 0 |
| 22.07.2023 19:00 - 20:00 | 0 | 0 | 0 | 0 |
| 22.07.2023 20:00 - 21:00 | 0 | 0 | 0 | 0 |
| 22.07.2023 21:00 - 22:00 | 0 | 0 | 0 | 0 |
| 22.07.2023 22:00 - 23:00 | 0 | 0 | 0 | 0 |
| 22.07.2023 23:00 - 24:00 | 0 | 0 | 0 | 0 |
| 23.07.2023 00:00 - 01:00 | 0 | 0 | 0 | 0 |
| 23.07.2023 01:00 - 02:00 | 0 | 0 | 0 | 0 |
| 23.07.2023 02:00 - 03:00 | 0 | 0 | 0 | 0 |
| 23.07.2023 03:00 - 04:00 | 0 | 0 | 0 | 0 |
| 23.07.2023 04:00 - 05:00 | 0 | 0 | 0 | 0 |
| 23.07.2023 05:00 - 06:00 | 0 | 0 | 0 | 0 |
| 23.07.2023 06:00 - 07:00 | 0 | 0 | 0 | 0 |
| 23.07.2023 07:00 - 08:00 | 0 | 0 | 0 | 0 |
| 23.07.2023 08:00 - 09:00 | 0 | 0 | 0 | 0 |
| 23.07.2023 09:00 - 10:00 | 0 | 0 | 0 | 0 |
| 23.07.2023 10:00 - 11:00 | 0 | 0 | 0 | 0 |
| 23.07.2023 11:00 - 12:00 | 0 | 0 | 0 | 0 |
| 23.07.2023 12:00 - 13:00 | 0 | 0 | 0 | 0 |
| 23.07.2023 13:00 - 14:00 | 0 | 0 | 0 | 0 |
| 23.07.2023 14:00 - 15:00 | 0 | 0 | 0 | 0 |
| 23.07.2023 15:00 - 16:00 | 0 | 0 | 0 | 0 |
| 23.07.2023 16:00 - 17:00 | 0 | 0 | 0 | 0 |
| 23.07.2023 17:00 - 18:00 | 0 | 0 | 0 | 0 |
| 23.07.2023 18:00 - 19:00 | 0 | 0 | 0 | 0 |
| 23.07.2023 19:00 - 20:00 | 0 | 0 | 0 | 0 |
| 23.07.2023 20:00 - 21:00 | 0 | 0 | 0 | 0 |
| 23.07.2023 21:00 - 22:00 | 0 | 0 | 0 | 0 |
| 23.07.2023 22:00 - 23:00 | 0 | 0 | 0 | 0 |
| 23.07.2023 23:00 - 24:00 | 0 | 0 | 0 | 0 |
| 24.07.2023 00:00 - 01:00 | 0 | 0 | 0 | 0 |
| 24.07.2023 01:00 - 02:00 | 0 | 0 | 0 | 0 |
| 24.07.2023 02:00 - 03:00 | 0 | 0 | 0 | 0 |
| 24.07.2023 03:00 - 04:00 | 0 | 0 | 0 | 0 |
| 24.07.2023 04:00 - 05:00 | 0 | 0 | 0 | 0 |
| 24.07.2023 05:00 - 06:00 | 0 | 0 | 0 | 0 |
| 24.07.2023 06:00 - 07:00 | 0 | 0 | 0 | 0 |
| 24.07.2023 07:00 - 08:00 | 0 | 0 | 0 | 0 |
| 24.07.2023 08:00 - 09:00 | 0 | 0 | 0 | 0 |
| 24.07.2023 09:00 - 10:00 | 0 | 0 | 0 | 0 |
| 24.07.2023 10:00 - 11:00 | 0 | 0 | 0 | 0 |
| 24.07.2023 11:00 - 12:00 | 0 | 0 | 0 | 0 |
| 24.07.2023 12:00 - 13:00 | 0 | 0 | 0 | 0 |
| 24.07.2023 13:00 - 14:00 | 0 | 0 | 0 | 0 |
| 24.07.2023 14:00 - 15:00 | 0 | 0 | 0 | 0 |
| 24.07.2023 15:00 - 16:00 | 0 | 0 | 0 | 0 |
| 24.07.2023 16:00 - 17:00 | 0 | 0 | 0 | 0 |
| 24.07.2023 17:00 - 18:00 | 0 | 0 | 0 | 0 |
| 24.07.2023 18:00 - 19:00 | 0 | 0 | 0 | 0 |
| 24.07.2023 19:00 - 20:00 | 0 | 0 | 0 | 0 |
| 24.07.2023 20:00 - 21:00 | 0 | 0 | 0 | 0 |
| 24.07.2023 21:00 - 22:00 | 0 | 0 | 0 | 0 |
| 24.07.2023 22:00 - 23:00 | 0 | 0 | 0 | 0 |
| 24.07.2023 23:00 - 24:00 | 0 | 0 | 0 | 0 |
| 25.07.2023 00:00 - 01:00 | 0 | 0 | 0 | 0 |
| 25.07.2023 01:00 - 02:00 | 0 | 0 | 0 | 0 |
| 25.07.2023 02:00 - 03:00 | 0 | 0 | 0 | 0 |
| 25.07.2023 03:00 - 04:00 | 0 | 0 | 0 | 0 |
| 25.07.2023 04:00 - 05:00 | 0 | 0 | 0 | 0 |
| 25.07.2023 05:00 - 06:00 | 0 | 0 | 0 | 0 |
| 25.07.2023 06:00 - 07:00 | 0 | 0 | 0 | 0 |
| 25.07.2023 07:00 - 08:00 | 0 | 0 | 0 | 0 |
| 25.07.2023 08:00 - 09:00 | 0 | 0 | 0 | 0 |
| 25.07.2023 09:00 - 10:00 | 0 | 0 | 0 | 0 |
| 25.07.2023 10:00 - 11:00 | 0 | 0 | 0 | 0 |
| 25.07.2023 11:00 - 12:00 | 0 | 0 | 0 | 0 |
| 25.07.2023 12:00 - 13:00 | 0 | 0 | 0 | 0 |
| 25.07.2023 13:00 - 14:00 | 0 | 0 | 0 | 0 |
| 25.07.2023 14:00 - 15:00 | 0 | 0 | 0 | 0 |
| 25.07.2023 15:00 - 16:00 | 0 | 0 | 0 | 0 |
| 25.07.2023 16:00 - 17:00 | 0 | 0 | 0 | 0 |
| 25.07.2023 17:00 - 18:00 | 0 | 0 | 0 | 0 |
| 25.07.2023 18:00 - 19:00 | 0 | 0 | 0 | 0 |
| 25.07.2023 19:00 - 20:00 | 0 | 0 | 0 | 0 |
| 25.07.2023 20:00 - 21:00 | 0 | 0 | 0 | 0 |
| 25.07.2023 21:00 - 22:00 | 0 | 0 | 0 | 0 |
| 25.07.2023 22:00 - 23:00 | 0 | 0 | 0 | 0 |
| 25.07.2023 23:00 - 24:00 | 0 | 0 | 0 | 0 |
| 26.07.2023 00:00 - 01:00 | 0 | 0 | 0 | 0 |
| 26.07.2023 01:00 - 02:00 | 0 | 0 | 0 | 0 |
| 26.07.2023 02:00 - 03:00 | 0 | 0 | 0 | 0 |
| 26.07.2023 03:00 - 04:00 | 0 | 0 | 0 | 0 |
| 26.07.2023 04:00 - 05:00 | 0 | 0 | 0 | 0 |
| 26.07.2023 05:00 - 06:00 | 0 | 0 | 0 | 0 |
| 26.07.2023 06:00 - 07:00 | 0 | 0 | 0 | 0 |
| 26.07.2023 07:00 - 08:00 | 0 | 0 | 0 | 0 |
| 26.07.2023 08:00 - 09:00 | 0 | 0 | 0 | 0 |
| 26.07.2023 09:00 - 10:00 | 0 | 0 | 0 | 0 |
| 26.07.2023 10:00 - 11:00 | 0 | 0 | 0 | 0 |
| 26.07.2023 11:00 - 12:00 | 0 | 0 | 0 | 0 |
| 26.07.2023 12:00 - 13:00 | 0 | 0 | 0 | 0 |
| 26.07.2023 13:00 - 14:00 | 0 | 0 | 0 | 0 |
| 26.07.2023 14:00 - 15:00 | 0 | 0 | 0 | 0 |
| 26.07.2023 15:00 - 16:00 | 0 | 0 | 0 | 0 |
| 26.07.2023 16:00 - 17:00 | 0 | 0 | 0 | 0 |
| 26.07.2023 17:00 - 18:00 | 0 | 0 | 0 | 0 |
| 26.07.2023 18:00 - 19:00 | 0 | 0 | 0 | 0 |
| 26.07.2023 19:00 - 20:00 | 0 | 0 | 0 | 0 |
| 26.07.2023 20:00 - 21:00 | 0 | 0 | 0 | 0 |
| 26.07.2023 21:00 - 22:00 | 0 | 0 | 0 | 0 |
| 26.07.2023 22:00 - 23:00 | 0 | 0 | 0 | 0 |
| 26.07.2023 23:00 - 24:00 | 0 | 0 | 0 | 0 |
| 27.07.2023 00:00 - 01:00 | 0 | 0 | 0 | 0 |
| 27.07.2023 01:00 - 02:00 | 0 | 0 | 0 | 0 |
| 27.07.2023 02:00 - 03:00 | 0 | 0 | 0 | 0 |
| 27.07.2023 03:00 - 04:00 | 0 | 0 | 0 | 0 |
| 27.07.2023 04:00 - 05:00 | 0 | 0 | 0 | 0 |
| 27.07.2023 05:00 - 06:00 | 0 | 0 | 0 | 0 |
| 27.07.2023 06:00 - 07:00 | 0 | 0 | 0 | 0 |
| 27.07.2023 07:00 - 08:00 | 0 | 0 | 0 | 0 |
| 27.07.2023 08:00 - 09:00 | 0 | 0 | 0 | 0 |
| 27.07.2023 09:00 - 10:00 | 0 | 0 | 0 | 0 |
| 27.07.2023 10:00 - 11:00 | 0 | 0 | 0 | 0 |
| 27.07.2023 11:00 - 12:00 | 0 | 0 | 0 | 0 |
| 27.07.2023 12:00 - 13:00 | 0 | 0 | 0 | 0 |
| 27.07.2023 13:00 - 14:00 | 0 | 0 | 0 | 0 |
| 27.07.2023 14:00 - 15:00 | 0 | 0 | 0 | 0 |
| 27.07.2023 15:00 - 16:00 | 0 | 0 | 0 | 0 |
| 27.07.2023 16:00 - 17:00 | 0 | 0 | 0 | 0 |
| 27.07.2023 17:00 - 18:00 | 0 | 0 | 0 | 0 |
| 27.07.2023 18:00 - 19:00 | 0 | 0 | 0 | 0 |
| 27.07.2023 19:00 - 20:00 | 0 | 0 | 0 | 0 |
| 27.07.2023 20:00 - 21:00 | 0 | 0 | 0 | 0 |
| 27.07.2023 21:00 - 22:00 | 0 | 0 | 0 | 0 |
| 27.07.2023 22:00 - 23:00 | 0 | 0 | 0 | 0 |
| 27.07.2023 23:00 - 24:00 | 0 | 0 | 0 | 0 |
| 28.07.2023 00:00 - 01:00 | 0 | 0 | 0 | 0 |
| 28.07.2023 01:00 - 02:00 | 0 | 0 | 0 | 0 |
| 28.07.2023 02:00 - 03:00 | 0 | 0 | 0 | 0 |
| 28.07.2023 03:00 - 04:00 | 0 | 0 | 0 | 0 |
| 28.07.2023 04:00 - 05:00 | 0 | 0 | 0 | 0 |
| 28.07.2023 05:00 - 06:00 | 0 | 0 | 0 | 0 |
| 28.07.2023 06:00 - 07:00 | 0 | 0 | 0 | 0 |
| 28.07.2023 07:00 - 08:00 | 0 | 0 | 0 | 0 |
| 28.07.2023 08:00 - 09:00 | 0 | 0 | 0 | 0 |
| 28.07.2023 09:00 - 10:00 | 0 | 0 | 0 | 0 |
| 28.07.2023 10:00 - 11:00 | 0 | 0 | 0 | 0 |
| 28.07.2023 11:00 - 12:00 | 0 | 0 | 0 | 0 |
| 28.07.2023 12:00 - 13:00 | 0 | 0 | 0 | 0 |
| 28.07.2023 13:00 - 14:00 | 0 | 0 | 0 | 0 |
| 28.07.2023 14:00 - 15:00 | 0 | 0 | 0 | 0 |
| 28.07.2023 15:00 - 16:00 | 0 | 0 | 0 | 0 |
| 28.07.2023 16:00 - 17:00 | 0 | 0 | 0 | 0 |
| 28.07.2023 17:00 - 18:00 | 0 | 0 | 0 | 0 |
| 28.07.2023 18:00 - 19:00 | 400 | 0 | 0 | 0 |
| 28.07.2023 19:00 - 20:00 | 400 | 0 | 0 | 0 |
| 28.07.2023 20:00 - 21:00 | 400 | 0 | 0 | 0 |
| 28.07.2023 21:00 - 22:00 | 400 | 0 | 0 | 0 |
| 28.07.2023 22:00 - 23:00 | 400 | 0 | 0 | 0 |
| 28.07.2023 23:00 - 24:00 | 400 | 0 | 0 | 0 |
| 29.07.2023 00:00 - 01:00 | 400 | 0 | 0 | 0 |
| 29.07.2023 01:00 - 02:00 | 400 | 0 | 0 | 0 |
| 29.07.2023 02:00 - 03:00 | 400 | 0 | 0 | 0 |
| 29.07.2023 03:00 - 04:00 | 400 | 0 | 0 | 0 |
| 29.07.2023 04:00 - 05:00 | 400 | 0 | 0 | 0 |
| 29.07.2023 05:00 - 06:00 | 400 | 0 | 0 | 0 |
| 29.07.2023 06:00 - 07:00 | 0 | 0 | 0 | 0 |
| 29.07.2023 07:00 - 08:00 | 0 | 0 | 0 | 0 |
| 29.07.2023 08:00 - 09:00 | 0 | 0 | 0 | 0 |
| 29.07.2023 09:00 - 10:00 | 0 | 0 | 0 | 0 |
| 29.07.2023 10:00 - 11:00 | 0 | 0 | 0 | 0 |
| 29.07.2023 11:00 - 12:00 | 0 | 0 | 0 | 0 |
| 29.07.2023 12:00 - 13:00 | 0 | 0 | 0 | 0 |
| 29.07.2023 13:00 - 14:00 | 0 | 0 | 0 | 0 |
| 29.07.2023 14:00 - 15:00 | 0 | 0 | 0 | 0 |
| 29.07.2023 15:00 - 16:00 | 0 | 0 | 0 | 0 |
| 29.07.2023 16:00 - 17:00 | 0 | 0 | 0 | 0 |
| 29.07.2023 17:00 - 18:00 | 0 | 0 | 0 | 0 |
| 29.07.2023 18:00 - 19:00 | 0 | 0 | 0 | 0 |
| 29.07.2023 19:00 - 20:00 | 0 | 0 | 0 | 0 |
| 29.07.2023 20:00 - 21:00 | 0 | 0 | 0 | 0 |
| 29.07.2023 21:00 - 22:00 | 0 | 0 | 0 | 0 |
| 29.07.2023 22:00 - 23:00 | 0 | 0 | 0 | 0 |
| 29.07.2023 23:00 - 24:00 | 0 | 0 | 0 | 0 |
| 30.07.2023 00:00 - 01:00 | 0 | 0 | 0 | 0 |
| 30.07.2023 01:00 - 02:00 | 0 | 0 | 0 | 0 |
| 30.07.2023 02:00 - 03:00 | 0 | 0 | 0 | 0 |
| 30.07.2023 03:00 - 04:00 | 0 | 0 | 0 | 0 |
| 30.07.2023 04:00 - 05:00 | 0 | 0 | 0 | 0 |
| 30.07.2023 05:00 - 06:00 | 0 | 0 | 0 | 0 |
| 30.07.2023 06:00 - 07:00 | 0 | 0 | 0 | 0 |
| 30.07.2023 07:00 - 08:00 | 0 | 0 | 0 | 0 |
| 30.07.2023 08:00 - 09:00 | 0 | 0 | 0 | 0 |
| 30.07.2023 09:00 - 10:00 | 0 | 0 | 0 | 0 |
| 30.07.2023 10:00 - 11:00 | 0 | 0 | 0 | 0 |
| 30.07.2023 11:00 - 12:00 | 0 | 0 | 0 | 0 |
| 30.07.2023 12:00 - 13:00 | 0 | 0 | 0 | 0 |
| 30.07.2023 13:00 - 14:00 | 0 | 0 | 0 | 0 |
| 30.07.2023 14:00 - 15:00 | 0 | 0 | 0 | 0 |
| 30.07.2023 15:00 - 16:00 | 0 | 0 | 0 | 0 |
| 30.07.2023 16:00 - 17:00 | 0 | 0 | 0 | 0 |
| 30.07.2023 17:00 - 18:00 | 0 | 0 | 0 | 0 |
| 30.07.2023 18:00 - 19:00 | 0 | -300 | 0 | 0 |
| 30.07.2023 19:00 - 20:00 | 0 | -300 | 0 | 0 |
| 30.07.2023 20:00 - 21:00 | 0 | -300 | 0 | 0 |
| 30.07.2023 21:00 - 22:00 | 0 | -300 | 0 | 0 |
| 30.07.2023 22:00 - 23:00 | 0 | -300 | 0 | 0 |
| 30.07.2023 23:00 - 24:00 | 0 | -300 | 0 | 0 |
| 31.07.2023 00:00 - 01:00 | 0 | -300 | 0 | 0 |
| 31.07.2023 01:00 - 02:00 | 0 | -300 | 0 | 0 |
| 31.07.2023 02:00 - 03:00 | 0 | -300 | 0 | 0 |
| 31.07.2023 03:00 - 04:00 | 0 | -300 | 0 | 0 |
| 31.07.2023 04:00 - 05:00 | 0 | -300 | 0 | 0 |
| 31.07.2023 05:00 - 06:00 | 0 | -300 | 0 | 0 |